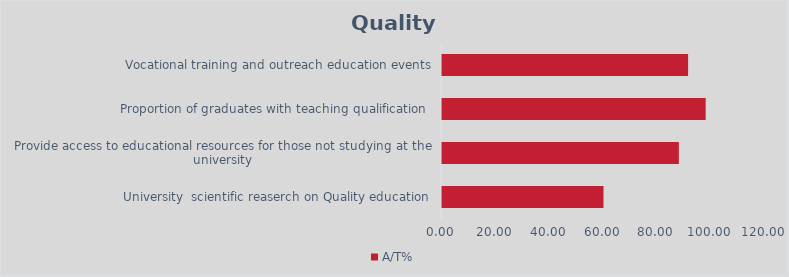
| Category | A/T% |
|---|---|
| University  scientific reaserch on Quality education | 60 |
| Provide access to educational resources for those not studying at the university | 88 |
| Proportion of graduates with teaching qualification  | 97.959 |
| Vocational training and outreach education events | 91.429 |